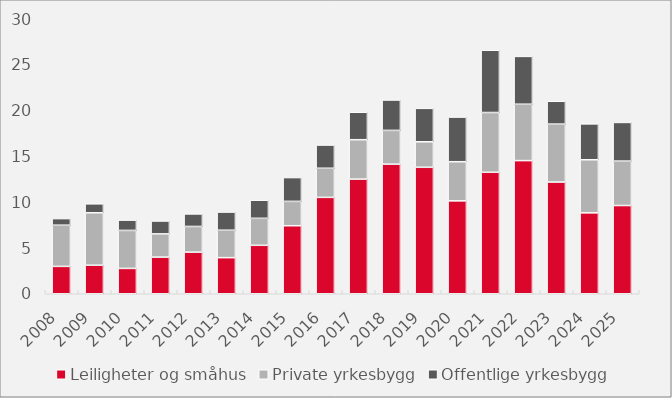
| Category | Leiligheter og småhus | Private yrkesbygg | Offentlige yrkesbygg |
|---|---|---|---|
| 2008.0 | 2.986 | 4.492 | 0.721 |
| 2009.0 | 3.114 | 5.718 | 0.981 |
| 2010.0 | 2.763 | 4.146 | 1.125 |
| 2011.0 | 3.996 | 2.537 | 1.404 |
| 2012.0 | 4.539 | 2.802 | 1.37 |
| 2013.0 | 3.938 | 2.994 | 1.981 |
| 2014.0 | 5.285 | 2.943 | 1.978 |
| 2015.0 | 7.423 | 2.655 | 2.596 |
| 2016.0 | 10.515 | 3.176 | 2.534 |
| 2017.0 | 12.507 | 4.299 | 2.994 |
| 2018.0 | 14.136 | 3.685 | 3.316 |
| 2019.0 | 13.796 | 2.783 | 3.648 |
| 2020.0 | 10.133 | 4.271 | 4.872 |
| 2021.0 | 13.252 | 6.519 | 6.796 |
| 2022.0 | 14.525 | 6.151 | 5.218 |
| 2023.0 | 12.186 | 6.321 | 2.49 |
| 2024.0 | 8.826 | 5.793 | 3.914 |
| 2025.0 | 9.625 | 4.846 | 4.218 |